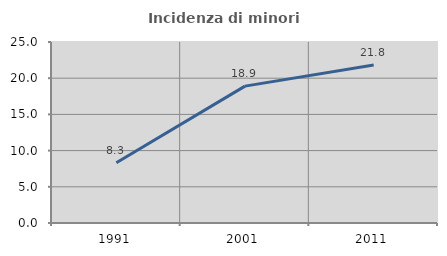
| Category | Incidenza di minori stranieri |
|---|---|
| 1991.0 | 8.333 |
| 2001.0 | 18.905 |
| 2011.0 | 21.836 |